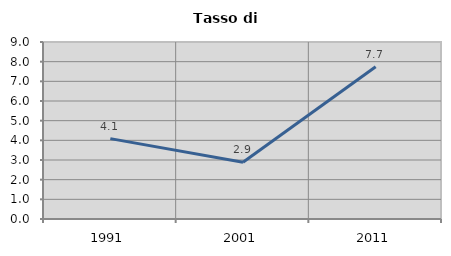
| Category | Tasso di disoccupazione   |
|---|---|
| 1991.0 | 4.086 |
| 2001.0 | 2.885 |
| 2011.0 | 7.739 |